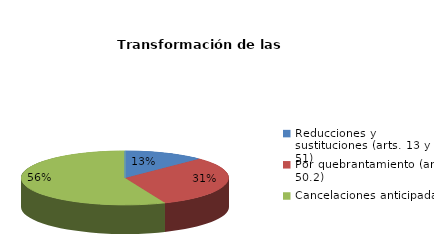
| Category | Series 0 |
|---|---|
| Reducciones y sustituciones (arts. 13 y 51) | 2 |
| Por quebrantamiento (art. 50.2) | 5 |
| Cancelaciones anticipadas | 9 |
| Traslado a Centros Penitenciarios | 0 |
| Conversión internamientos en cerrados (art. 51.2) | 0 |